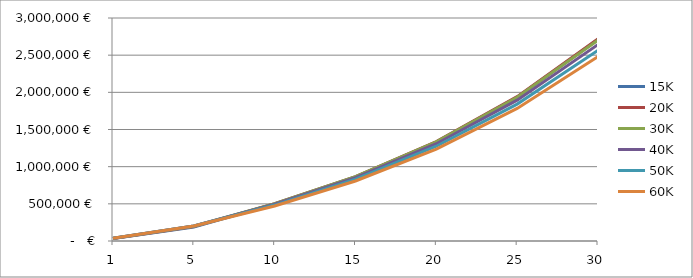
| Category | 15K | 20K | 30K | 40K | 50K | 60K |
|---|---|---|---|---|---|---|
| 1.0 | 33221.72 | 34039.96 | 35192.6 | 35739.24 | 35994.86 | 36127.42 |
| 5.0 | 189483.728 | 193537.022 | 198922.766 | 200900.705 | 201242.112 | 200891.498 |
| 10.0 | 498389.024 | 501647.076 | 501974.349 | 494550.232 | 483403.657 | 470683.013 |
| 15.0 | 861873.735 | 866672.173 | 865678.569 | 851420.598 | 830792.666 | 807471.148 |
| 20.0 | 1330947.591 | 1337035.201 | 1333033.267 | 1308769.769 | 1274776.04 | 1236667.81 |
| 25.0 | 1935101.246 | 1942067.557 | 1932732.295 | 1894254.469 | 1841781.48 | 1783390.531 |
| 30.0 | 2711585.366 | 2718833.244 | 2701061.399 | 2642875.024 | 2565280.338 | 2479478.701 |